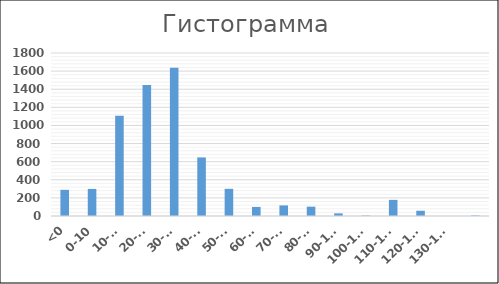
| Category | Series 0 |
|---|---|
| <0 | 289 |
| 0-10 | 299 |
| 10-20 | 1108 |
| 20-30 | 1447 |
| 30-40 | 1638 |
| 40-50 | 647 |
| 50-60 | 300 |
| 60-70 | 100 |
| 70-80 | 117 |
| 80-90 | 103 |
| 90-100 | 29 |
| 100-110 | 5 |
| 110-120 | 178 |
| 120-130 | 58 |
| 130-140 | 0 |